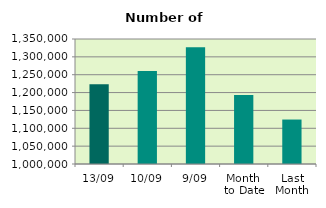
| Category | Series 0 |
|---|---|
| 13/09 | 1223052 |
| 10/09 | 1260626 |
| 9/09 | 1326840 |
| Month 
to Date | 1193048.889 |
| Last
Month | 1124493.364 |